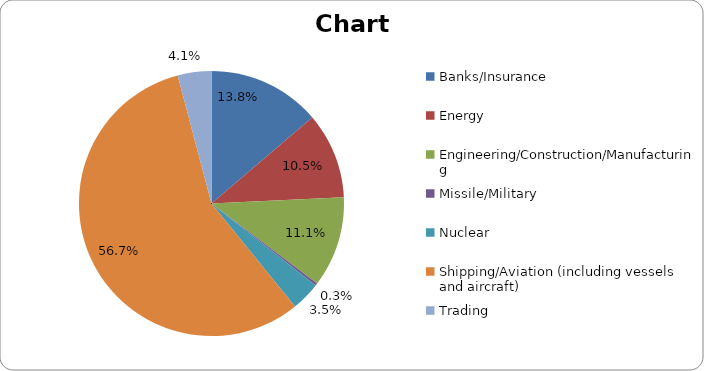
| Category | Series 0 |
|---|---|
| Banks/Insurance | 97 |
| Energy | 74 |
| Engineering/Construction/Manufacturing | 78 |
| Missile/Military | 2 |
| Nuclear | 25 |
| Shipping/Aviation (including vessels and aircraft) | 400 |
| Trading | 29 |